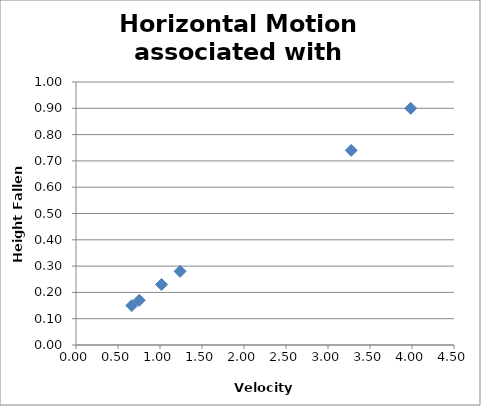
| Category | Series 0 |
|---|---|
| 0.66407830863536 | 0.15 |
| 0.752622083120074 | 0.17 |
| 3.276119655934441 | 0.74 |
| 3.984469851812158 | 0.9 |
| 1.239612842786005 | 0.28 |
| 1.018253406574218 | 0.23 |